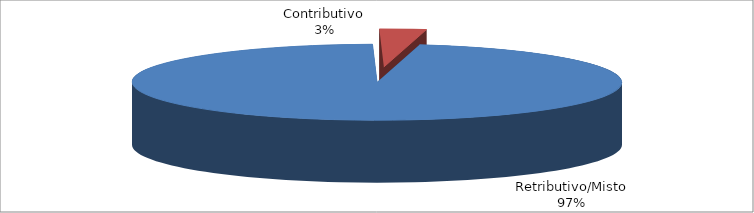
| Category | Series 1 |
|---|---|
| Retributivo/Misto | 129826 |
| Contributivo | 4116 |